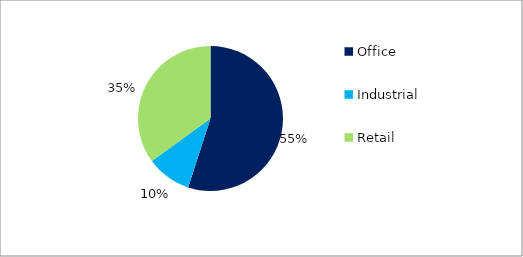
| Category | Series 0 |
|---|---|
| Office | 0.55 |
| Industrial  | 0.1 |
| Retail  | 0.35 |